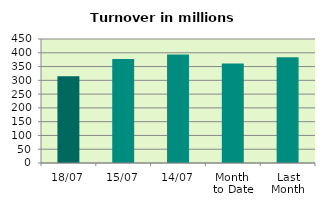
| Category | Series 0 |
|---|---|
| 18/07 | 315.038 |
| 15/07 | 377.472 |
| 14/07 | 393.55 |
| Month 
to Date | 361.04 |
| Last
Month | 384.158 |